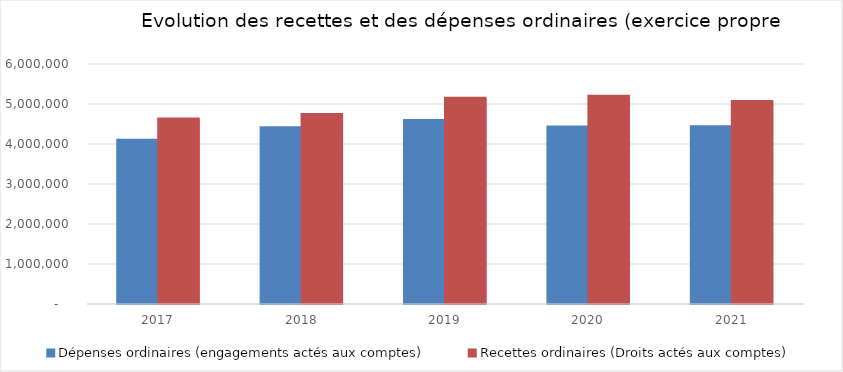
| Category | Dépenses ordinaires (engagements actés aux comptes) | Recettes ordinaires (Droits actés aux comptes) |
|---|---|---|
| 2017.0 | 4093423.34 | 4626172.3 |
| 2018.0 | 4407270.53 | 4739861 |
| 2019.0 | 4587211.42 | 5141720.52 |
| 2020.0 | 4422939.13 | 5192181.96 |
| 2021.0 | 4432507.98 | 5059614.03 |